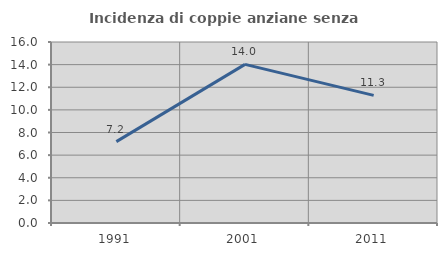
| Category | Incidenza di coppie anziane senza figli  |
|---|---|
| 1991.0 | 7.194 |
| 2001.0 | 14.024 |
| 2011.0 | 11.282 |